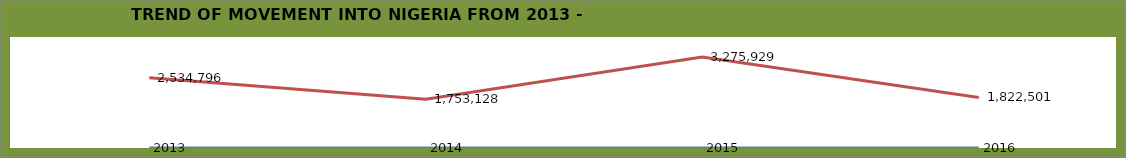
| Category | Series 0 | Series 1 |
|---|---|---|
| 0 | 2013 | 2534796 |
| 1 | 2014 | 1753128 |
| 2 | 2015 | 3275929 |
| 3 | 2016 | 1822501 |